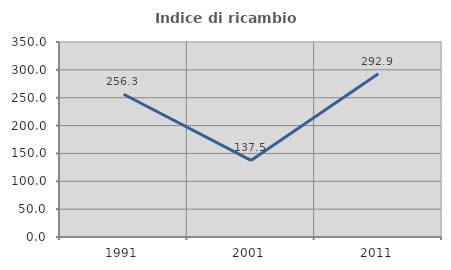
| Category | Indice di ricambio occupazionale  |
|---|---|
| 1991.0 | 256.25 |
| 2001.0 | 137.5 |
| 2011.0 | 292.857 |